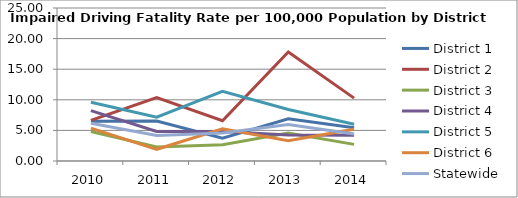
| Category | District 1 | District 2 | District 3 | District 4 | District 5 | District 6 | Statewide |
|---|---|---|---|---|---|---|---|
| 2010.0 | 6.505 | 6.641 | 4.812 | 8.226 | 9.607 | 5.379 | 6.155 |
| 2011.0 | 6.523 | 10.356 | 2.284 | 4.813 | 7.172 | 1.911 | 4.164 |
| 2012.0 | 3.713 | 6.573 | 2.675 | 4.808 | 11.395 | 5.25 | 4.575 |
| 2013.0 | 6.895 | 17.826 | 4.568 | 4.236 | 8.427 | 3.325 | 5.955 |
| 2014.0 | 5.42 | 10.277 | 2.713 | 4.2 | 6.016 | 5.183 | 4.405 |